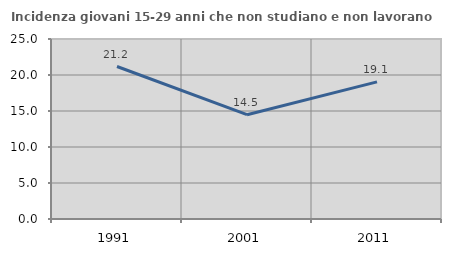
| Category | Incidenza giovani 15-29 anni che non studiano e non lavorano  |
|---|---|
| 1991.0 | 21.178 |
| 2001.0 | 14.489 |
| 2011.0 | 19.051 |